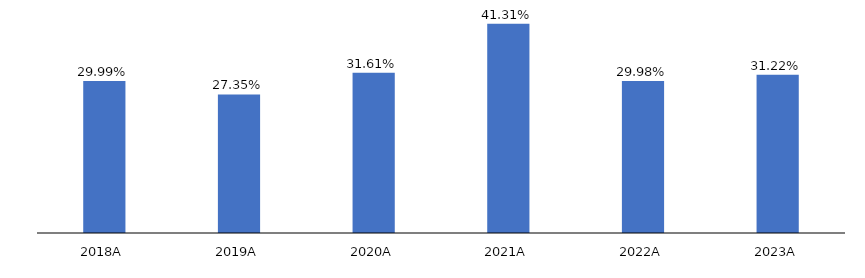
| Category | ROIC |
|---|---|
| 2018.0 | 0.3 |
| 2019.0 | 0.274 |
| 2020.0 | 0.316 |
| 2021.0 | 0.413 |
| 2022.0 | 0.3 |
| 2023.0 | 0.312 |